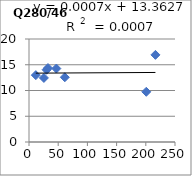
| Category | Q280/465 |
|---|---|
| 25.5 | 12.44 |
| 61.3 | 12.57 |
| 11.7 | 12.98 |
| 216.5 | 16.92 |
| 46.8 | 14.26 |
| 32.5 | 14.36 |
| 200.8 | 9.75 |
| 30.1 | 14.03 |